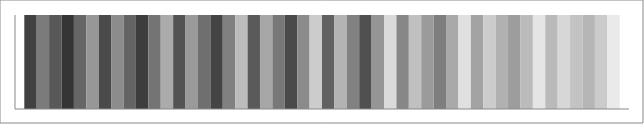
| Category | Series 1 | Series 2 | Series 3 | Series 4 | Series 5 | Series 6 | Series 7 | Series 8 | Series 9 | Series 10 | Series 11 | Series 12 | Series 13 | Series 14 | Series 15 | Series 16 | Series 17 | Series 18 | Series 19 | Series 20 | Series 21 | Series 22 | Series 23 | Series 24 | Series 25 | Series 26 | Series 27 | Series 28 | Series 29 | Series 30 | Series 31 | Series 32 | Series 33 | Series 34 | Series 35 | Series 36 | Series 37 | Series 38 | Series 39 | Series 40 | Series 41 | Series 42 | Series 43 | Series 44 | Series 45 | Series 46 | Series 47 | Series 48 |
|---|---|---|---|---|---|---|---|---|---|---|---|---|---|---|---|---|---|---|---|---|---|---|---|---|---|---|---|---|---|---|---|---|---|---|---|---|---|---|---|---|---|---|---|---|---|---|---|---|
| Point 1 | 1 | 1 | 1 | 1 | 1 | 1 | 1 | 1 | 1 | 1 | 1 | 1 | 1 | 1 | 1 | 1 | 1 | 1 | 1 | 1 | 1 | 1 | 1 | 1 | 1 | 1 | 1 | 1 | 1 | 1 | 1 | 1 | 1 | 1 | 1 | 1 | 1 | 1 | 1 | 1 | 1 | 1 | 1 | 1 | 1 | 1 | 1 | 1 |